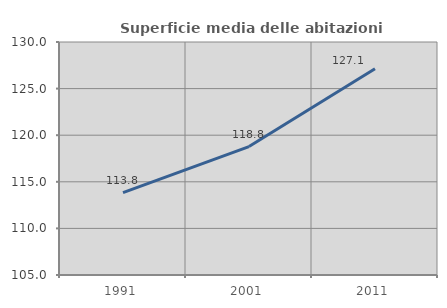
| Category | Superficie media delle abitazioni occupate |
|---|---|
| 1991.0 | 113.847 |
| 2001.0 | 118.778 |
| 2011.0 | 127.12 |